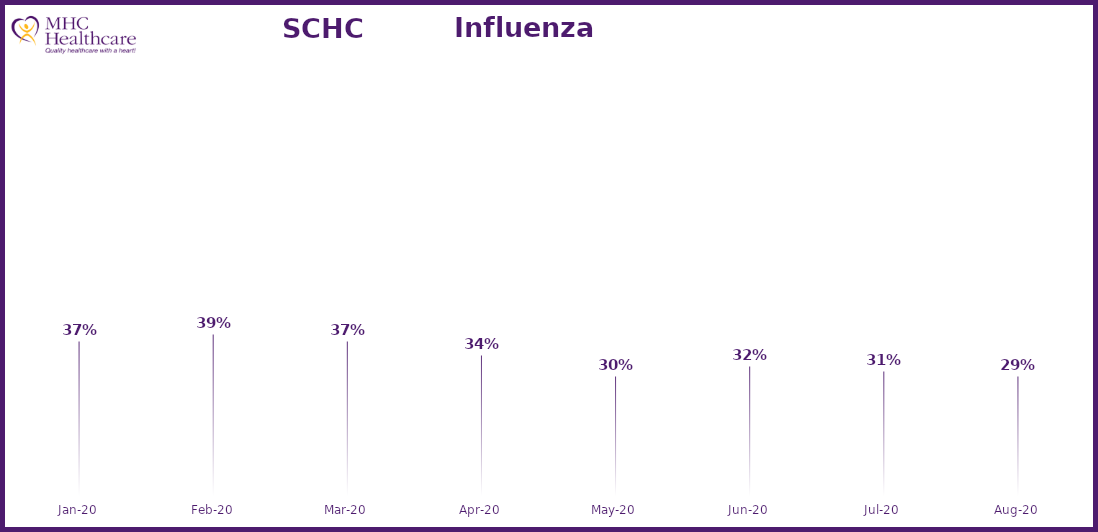
| Category | Online Access to Health Information |
|---|---|
| 2020-01-01 | 0.373 |
| 2020-02-01 | 0.391 |
| 2020-03-01 | 0.374 |
| 2020-04-01 | 0.343 |
| 2020-05-01 | 0.295 |
| 2020-06-01 | 0.317 |
| 2020-07-01 | 0.306 |
| 2020-08-01 | 0.294 |